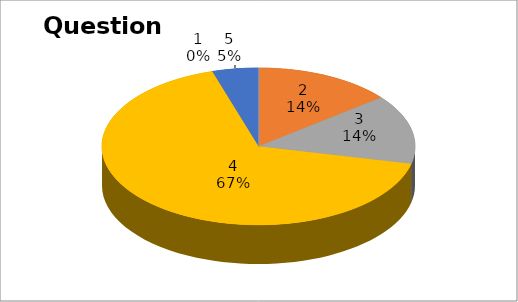
| Category | Series 0 |
|---|---|
| 0 | 0 |
| 1 | 3 |
| 2 | 3 |
| 3 | 14 |
| 4 | 1 |